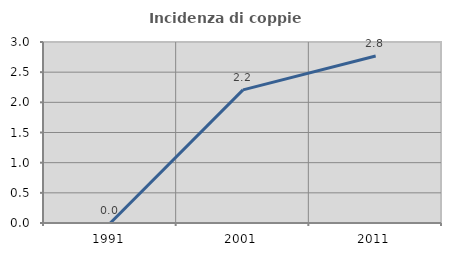
| Category | Incidenza di coppie miste |
|---|---|
| 1991.0 | 0 |
| 2001.0 | 2.206 |
| 2011.0 | 2.767 |